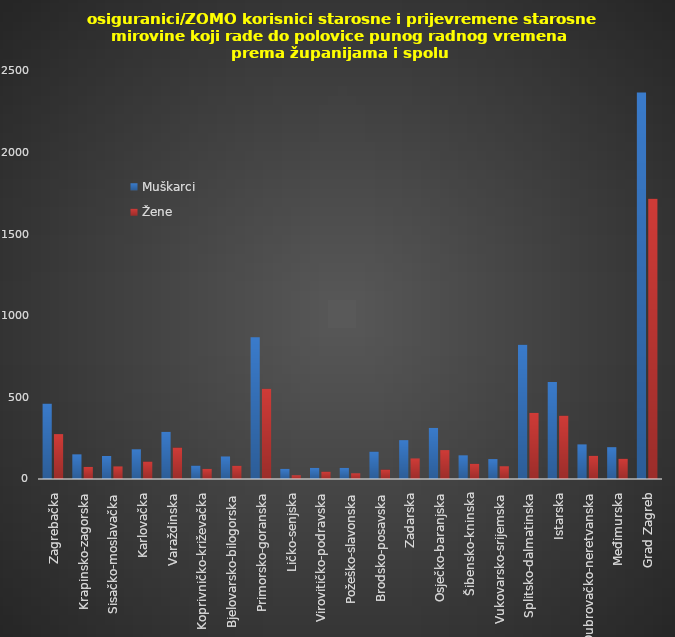
| Category | Muškarci | Žene |
|---|---|---|
| Zagrebačka | 462 | 275 |
| Krapinsko-zagorska | 151 | 74 |
| Sisačko-moslavačka | 141 | 77 |
| Karlovačka | 182 | 107 |
| Varaždinska | 289 | 193 |
| Koprivničko-križevačka | 82 | 62 |
| Bjelovarsko-bilogorska | 138 | 81 |
| Primorsko-goranska | 869 | 553 |
| Ličko-senjska | 62 | 23 |
| Virovitičko-podravska | 68 | 45 |
| Požeško-slavonska | 68 | 35 |
| Brodsko-posavska | 168 | 58 |
| Zadarska | 238 | 126 |
| Osječko-baranjska | 313 | 177 |
| Šibensko-kninska | 145 | 93 |
| Vukovarsko-srijemska | 122 | 78 |
| Splitsko-dalmatinska | 823 | 405 |
| Istarska | 594 | 388 |
| Dubrovačko-neretvanska | 212 | 142 |
| Međimurska | 195 | 124 |
| Grad Zagreb | 2369 | 1717 |